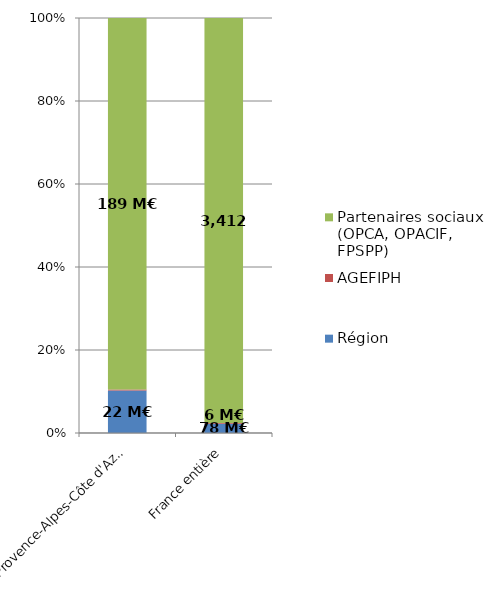
| Category | Région | AGEFIPH | Partenaires sociaux (OPCA, OPACIF, FPSPP) |
|---|---|---|---|
| Provence-Alpes-Côte d'Azur | 21.647 | 0.466 | 188.996 |
| France entière | 77.612 | 6.161 | 3411.683 |